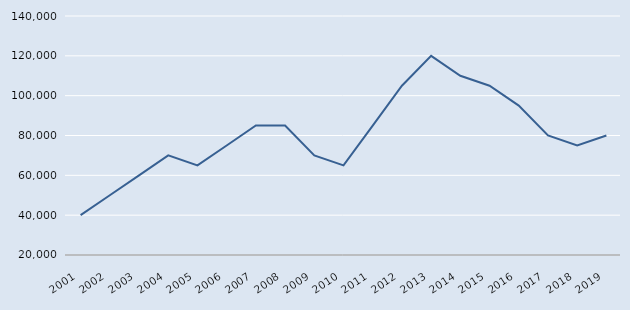
| Category | Série nova |
|---|---|
| 2001.0 | 40000 |
| 2002.0 | 50000 |
| 2003.0 | 60000 |
| 2004.0 | 70000 |
| 2005.0 | 65000 |
| 2006.0 | 75000 |
| 2007.0 | 85000 |
| 2008.0 | 85000 |
| 2009.0 | 70000 |
| 2010.0 | 65000 |
| 2011.0 | 85000 |
| 2012.0 | 105000 |
| 2013.0 | 120000 |
| 2014.0 | 110000 |
| 2015.0 | 105000 |
| 2016.0 | 95000 |
| 2017.0 | 80000 |
| 2018.0 | 75000 |
| 2019.0 | 80000 |